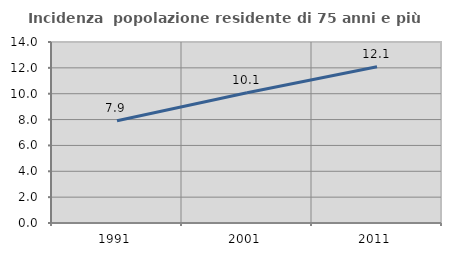
| Category | Incidenza  popolazione residente di 75 anni e più |
|---|---|
| 1991.0 | 7.915 |
| 2001.0 | 10.072 |
| 2011.0 | 12.089 |